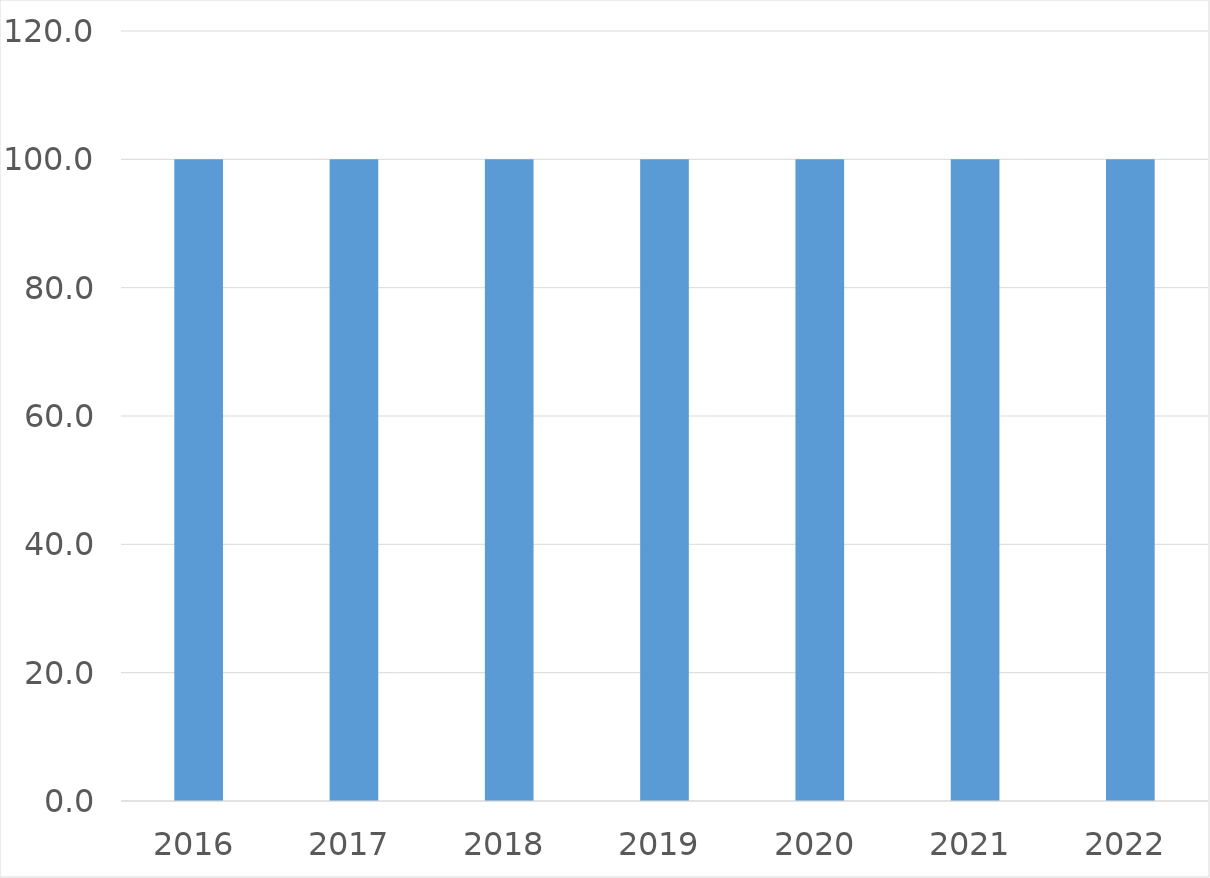
| Category | Series 0 |
|---|---|
| 2016 | 100 |
| 2017 | 100 |
| 2018 | 100 |
| 2019 | 100 |
| 2020 | 100 |
| 2021 | 100 |
| 2022 | 100 |